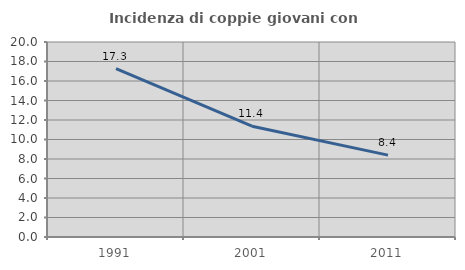
| Category | Incidenza di coppie giovani con figli |
|---|---|
| 1991.0 | 17.266 |
| 2001.0 | 11.36 |
| 2011.0 | 8.397 |